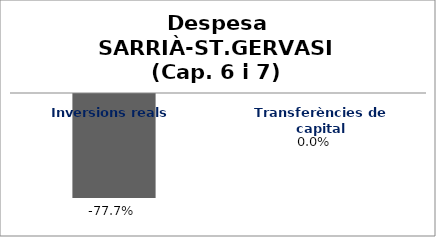
| Category | Series 0 |
|---|---|
| Inversions reals | -0.777 |
| Transferències de capital | 0 |